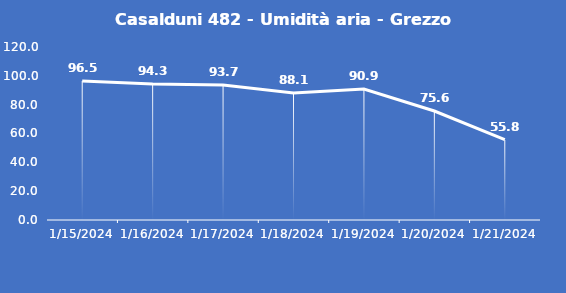
| Category | Casalduni 482 - Umidità aria - Grezzo (%) |
|---|---|
| 1/15/24 | 96.5 |
| 1/16/24 | 94.3 |
| 1/17/24 | 93.7 |
| 1/18/24 | 88.1 |
| 1/19/24 | 90.9 |
| 1/20/24 | 75.6 |
| 1/21/24 | 55.8 |